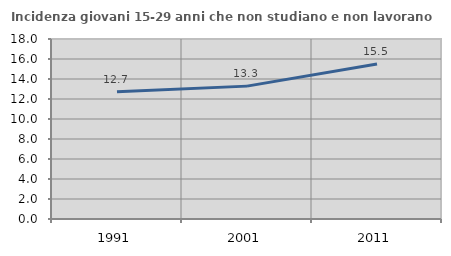
| Category | Incidenza giovani 15-29 anni che non studiano e non lavorano  |
|---|---|
| 1991.0 | 12.727 |
| 2001.0 | 13.287 |
| 2011.0 | 15.493 |